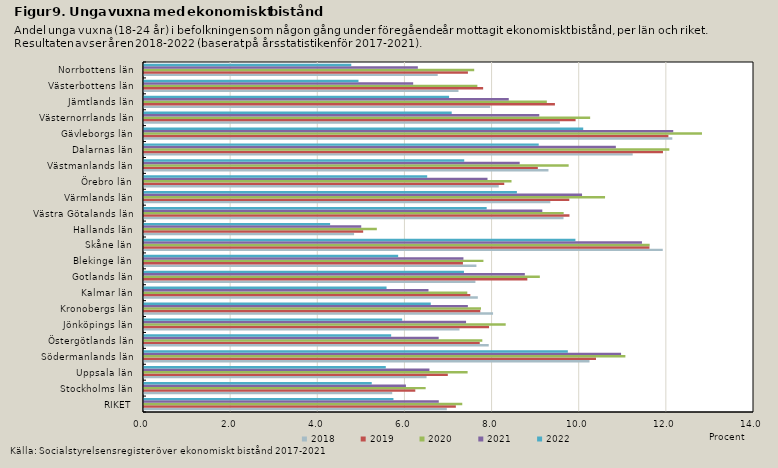
| Category | 2018 | 2019 | 2020 | 2021 | 2022 |
|---|---|---|---|---|---|
| RIKET | 6.95 | 7.157 | 7.304 | 6.765 | 5.725 |
| Stockholms län | 5.697 | 6.227 | 6.464 | 6.012 | 5.227 |
| Uppsala län | 6.485 | 6.973 | 7.427 | 6.551 | 5.549 |
| Södermanlands län | 10.224 | 10.373 | 11.048 | 10.949 | 9.727 |
| Östergötlands län | 7.912 | 7.706 | 7.765 | 6.763 | 5.672 |
| Jönköpings län | 7.241 | 7.919 | 8.301 | 7.391 | 5.925 |
| Kronobergs län | 8.011 | 7.719 | 7.734 | 7.433 | 6.582 |
| Kalmar län | 7.662 | 7.489 | 7.42 | 6.529 | 5.567 |
| Gotlands län | 7.606 | 8.798 | 9.085 | 8.741 | 7.343 |
| Blekinge län | 7.629 | 7.32 | 7.79 | 7.331 | 5.833 |
| Skåne län | 11.906 | 11.601 | 11.606 | 11.429 | 9.902 |
| Hallands län | 4.822 | 5.03 | 5.344 | 4.986 | 4.272 |
| Västra Götalands län | 9.628 | 9.765 | 9.632 | 9.142 | 7.865 |
| Värmlands län | 9.326 | 9.761 | 10.582 | 10.054 | 8.558 |
| Örebro län | 8.142 | 8.268 | 8.435 | 7.884 | 6.499 |
| Västmanlands län | 9.283 | 9.039 | 9.747 | 8.623 | 7.35 |
| Dalarnas län | 11.216 | 11.911 | 12.057 | 10.829 | 9.059 |
| Gävleborgs län | 12.125 | 12.036 | 12.806 | 12.147 | 10.08 |
| Västernorrlands län | 9.545 | 9.905 | 10.24 | 9.072 | 7.062 |
| Jämtlands län | 7.947 | 9.431 | 9.246 | 8.372 | 7.002 |
| Västerbottens län | 7.217 | 7.784 | 7.651 | 6.178 | 4.923 |
| Norrbottens län | 6.741 | 7.434 | 7.579 | 6.285 | 4.757 |